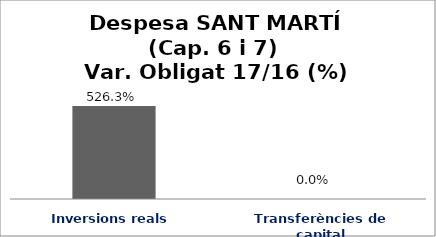
| Category | Series 0 |
|---|---|
| Inversions reals | 5.263 |
| Transferències de capital | 0 |